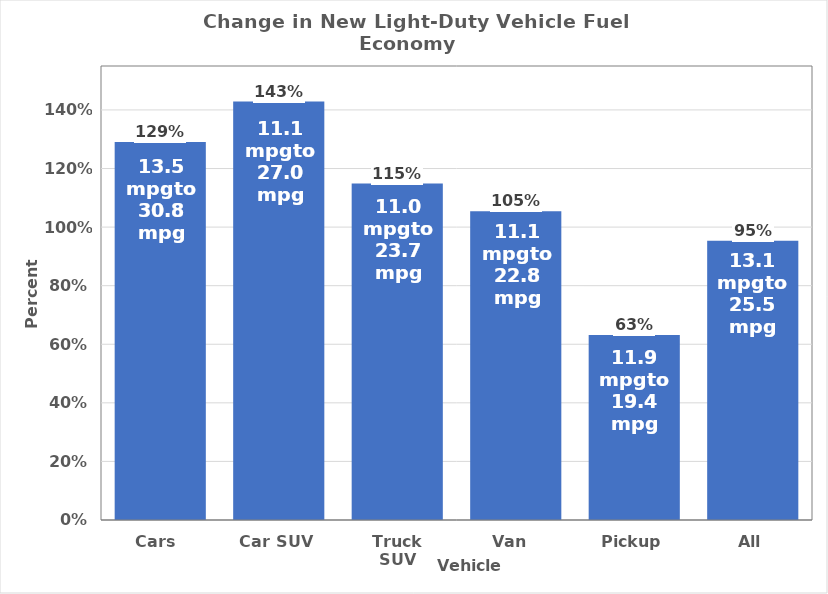
| Category | Fuel Economy Change |
|---|---|
| Cars  | 1.29 |
| Car SUV | 1.429 |
| Truck SUV | 1.149 |
| Van  | 1.054 |
| Pickup | 0.631 |
| All | 0.954 |